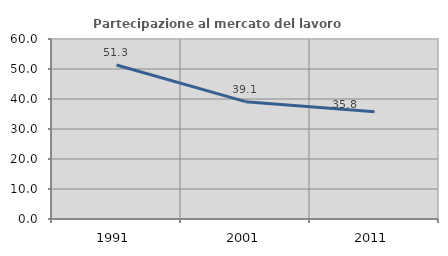
| Category | Partecipazione al mercato del lavoro  femminile |
|---|---|
| 1991.0 | 51.336 |
| 2001.0 | 39.108 |
| 2011.0 | 35.773 |